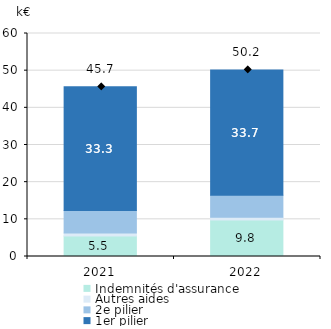
| Category | Indemnités d'assurance | Autres aides | 2e pilier | 1er pilier |
|---|---|---|---|---|
| 0 | 5.53 | 0.8 | 6.07 | 33.26 |
| 1 | 9.82 | 0.76 | 5.89 | 33.72 |